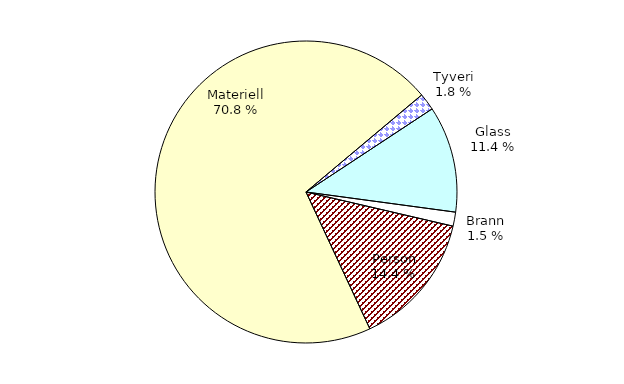
| Category | Series 0 |
|---|---|
| Tyveri | 122.77 |
| Glass | 761.785 |
| Brann | 100.376 |
| Person | 962.65 |
| Materiell | 4731.128 |